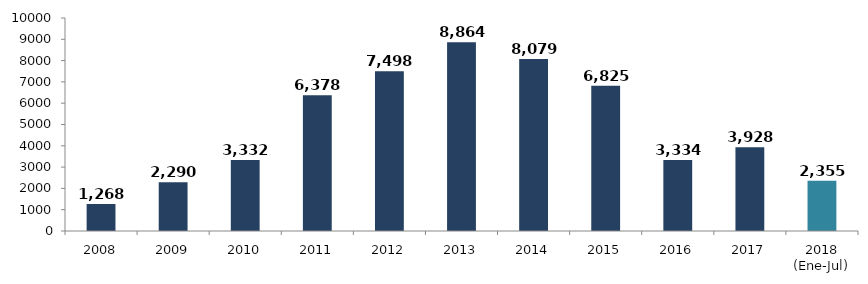
| Category | Series 0 |
|---|---|
| 2008 | 1267.813 |
| 2009 | 2290.273 |
| 2010 | 3331.554 |
| 2011 | 6377.615 |
| 2012 | 7498.207 |
| 2013 | 8863.622 |
| 2014 | 8079.21 |
| 2015 | 6824.624 |
| 2016 | 3333.564 |
| 2017 | 3928.017 |
| 2018 (Ene-Jul) | 2355.315 |